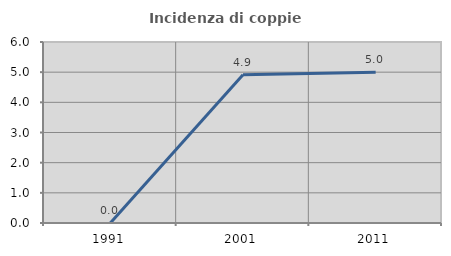
| Category | Incidenza di coppie miste |
|---|---|
| 1991.0 | 0 |
| 2001.0 | 4.918 |
| 2011.0 | 5 |